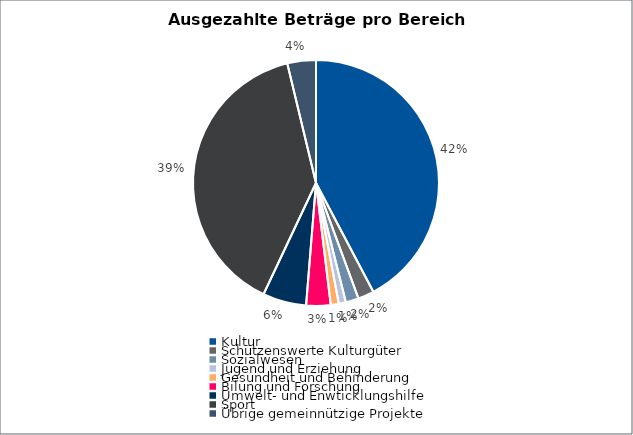
| Category | Series 0 |
|---|---|
| Kultur | 17578000 |
| Schützenswerte Kulturgüter | 880000 |
| Sozialwesen | 707000 |
| Jugend und Erziehung | 387000 |
| Gesundheit und Behinderung | 439000 |
| Bilung und Forschung | 1333000 |
| Umwelt- und Enwticklungshilfe | 2381000 |
| Sport | 16313100 |
| Übrige gemeinnützige Projekte | 1560000 |